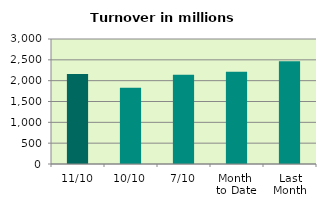
| Category | Series 0 |
|---|---|
| 11/10 | 2157.044 |
| 10/10 | 1829.187 |
| 7/10 | 2143.367 |
| Month 
to Date | 2214.122 |
| Last
Month | 2468.023 |